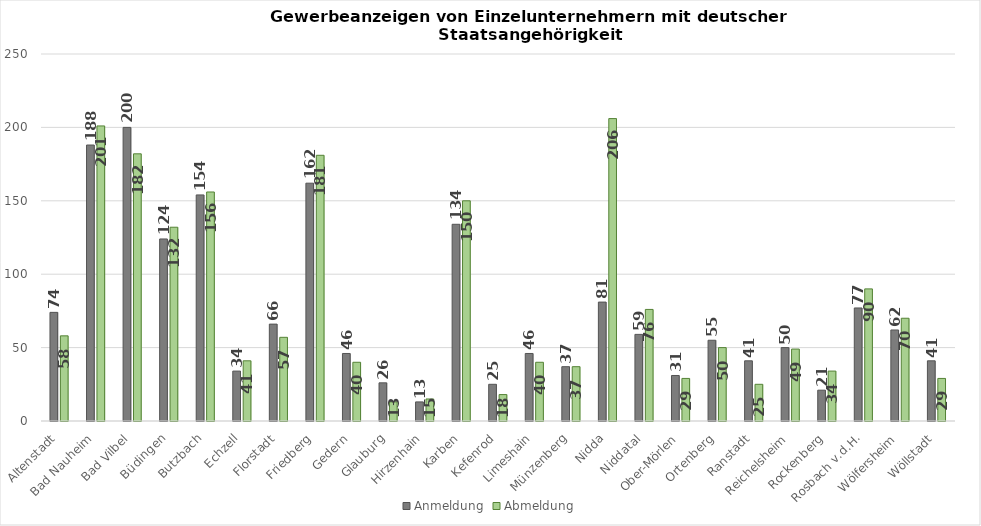
| Category | Anmeldung | Abmeldung |
|---|---|---|
| Altenstadt | 74 | 58 |
| Bad Nauheim | 188 | 201 |
| Bad Vilbel | 200 | 182 |
| Büdingen | 124 | 132 |
| Butzbach | 154 | 156 |
| Echzell | 34 | 41 |
| Florstadt | 66 | 57 |
| Friedberg | 162 | 181 |
| Gedern | 46 | 40 |
| Glauburg | 26 | 13 |
| Hirzenhain | 13 | 15 |
| Karben | 134 | 150 |
| Kefenrod | 25 | 18 |
| Limeshain | 46 | 40 |
| Münzenberg | 37 | 37 |
| Nidda | 81 | 206 |
| Niddatal | 59 | 76 |
| Ober-Mörlen | 31 | 29 |
| Ortenberg | 55 | 50 |
| Ranstadt | 41 | 25 |
| Reichelsheim | 50 | 49 |
| Rockenberg | 21 | 34 |
| Rosbach v.d.H. | 77 | 90 |
| Wölfersheim | 62 | 70 |
| Wöllstadt | 41 | 29 |